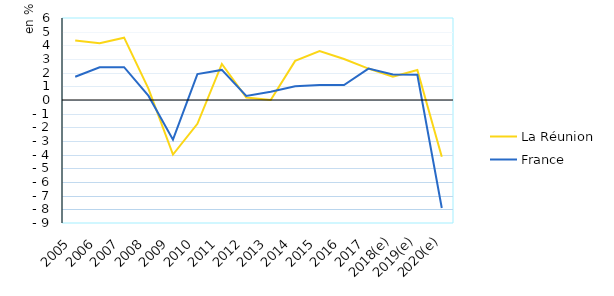
| Category | La Réunion | France |
|---|---|---|
| 2005 | 4.35 | 1.7 |
| 2006 | 4.15 | 2.4 |
| 2007 | 4.56 | 2.4 |
| 2008 | 0.82 | 0.3 |
| 2009 | -3.99 | -2.9 |
| 2010 | -1.74 | 1.9 |
| 2011 | 2.64 | 2.2 |
| 2012 | 0.18 | 0.3 |
| 2013 | 0 | 0.6 |
| 2014 | 2.86 | 1 |
| 2015 | 3.58 | 1.1 |
| 2016 | 3 | 1.1 |
| 2017 | 2.3 | 2.3 |
| 2018(e) | 1.7 | 1.865 |
| 2019(e) | 2.2 | 1.843 |
| 2020(e) | -4.15 | -7.9 |